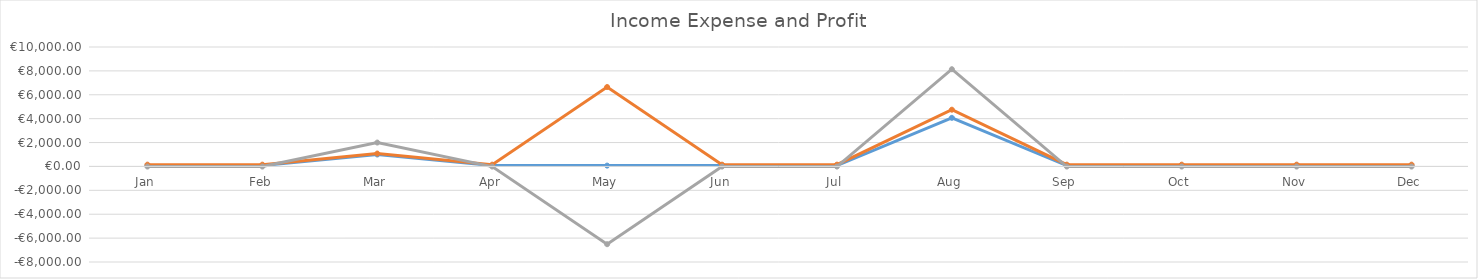
| Category | Income | Expense | Profit |
|---|---|---|---|
| Jan | 70 | 80 | -10 |
| Feb | 70 | 80 | -10 |
| Mar | 1000 | 80 | 920 |
| Apr | 70 | 80 | -10 |
| May | 70 | 6580 | -6510 |
| Jun | 70 | 80 | -10 |
| Jul | 70 | 80 | -10 |
| Aug | 4070 | 680 | 3390 |
| Sep | 70 | 80 | -10 |
| Oct | 70 | 80 | -10 |
| Nov | 70 | 80 | -10 |
| Dec | 70 | 80 | -10 |